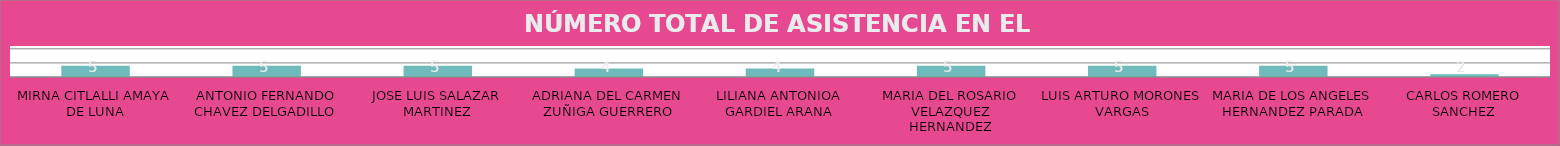
| Category | MIRNA CITLALLI AMAYA DE LUNA |
|---|---|
| MIRNA CITLALLI AMAYA DE LUNA | 5 |
| ANTONIO FERNANDO CHAVEZ DELGADILLO | 5 |
| JOSE LUIS SALAZAR MARTINEZ | 5 |
| ADRIANA DEL CARMEN ZUÑIGA GUERRERO | 4 |
| LILIANA ANTONIOA GARDIEL ARANA | 4 |
| MARIA DEL ROSARIO VELAZQUEZ HERNANDEZ | 5 |
| LUIS ARTURO MORONES VARGAS | 5 |
| MARIA DE LOS ANGELES HERNANDEZ PARADA | 5 |
| CARLOS ROMERO SANCHEZ | 2 |